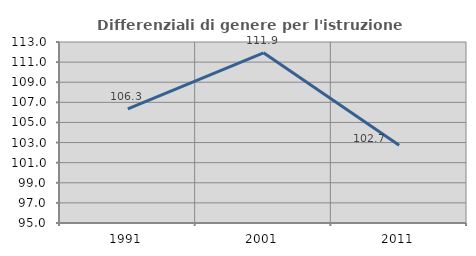
| Category | Differenziali di genere per l'istruzione superiore |
|---|---|
| 1991.0 | 106.343 |
| 2001.0 | 111.929 |
| 2011.0 | 102.729 |